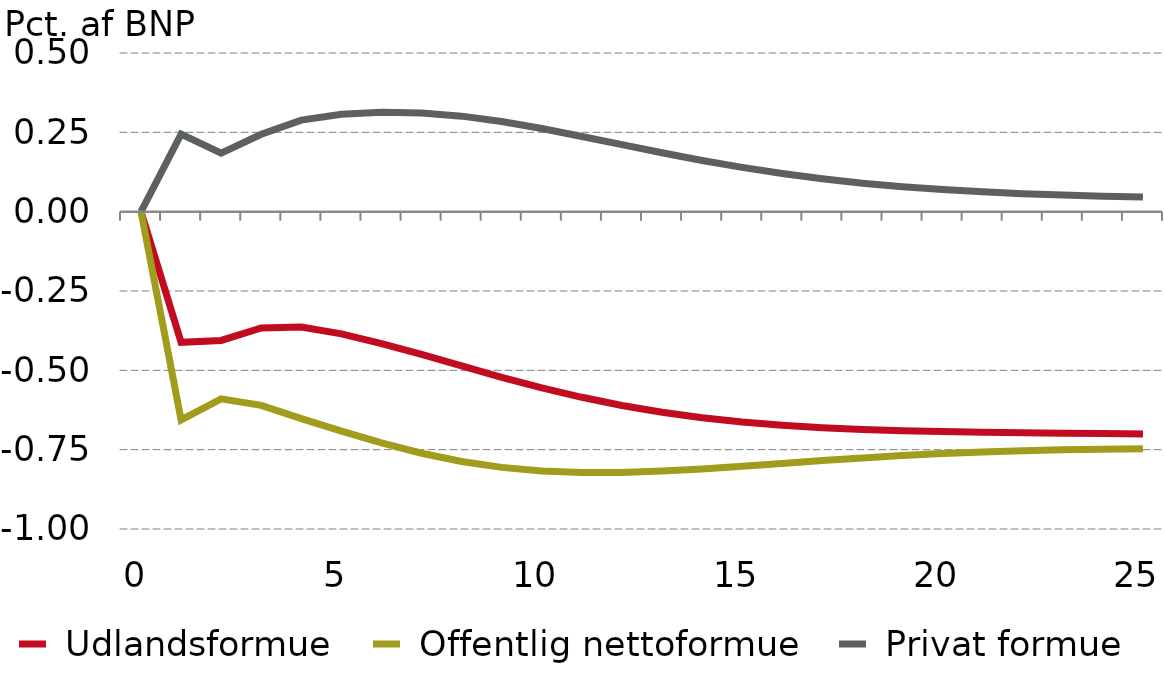
| Category |  Udlandsformue |  Offentlig nettoformue |  Privat formue |
|---|---|---|---|
| 0.0 | 0 | 0 | 0 |
| nan | -0.412 | -0.656 | 0.245 |
| nan | -0.406 | -0.59 | 0.184 |
| nan | -0.366 | -0.61 | 0.244 |
| nan | -0.364 | -0.652 | 0.289 |
| 5.0 | -0.385 | -0.692 | 0.307 |
| nan | -0.416 | -0.729 | 0.313 |
| nan | -0.45 | -0.761 | 0.311 |
| nan | -0.486 | -0.787 | 0.301 |
| nan | -0.522 | -0.806 | 0.284 |
| 10.0 | -0.555 | -0.817 | 0.262 |
| nan | -0.585 | -0.822 | 0.237 |
| nan | -0.611 | -0.822 | 0.211 |
| nan | -0.632 | -0.818 | 0.186 |
| nan | -0.649 | -0.811 | 0.161 |
| 15.0 | -0.663 | -0.802 | 0.139 |
| nan | -0.673 | -0.793 | 0.12 |
| nan | -0.681 | -0.784 | 0.104 |
| nan | -0.686 | -0.776 | 0.09 |
| nan | -0.69 | -0.769 | 0.079 |
| 20.0 | -0.693 | -0.762 | 0.07 |
| nan | -0.695 | -0.757 | 0.062 |
| nan | -0.697 | -0.753 | 0.057 |
| nan | -0.698 | -0.75 | 0.052 |
| nan | -0.699 | -0.748 | 0.049 |
| 25.0 | -0.701 | -0.747 | 0.046 |